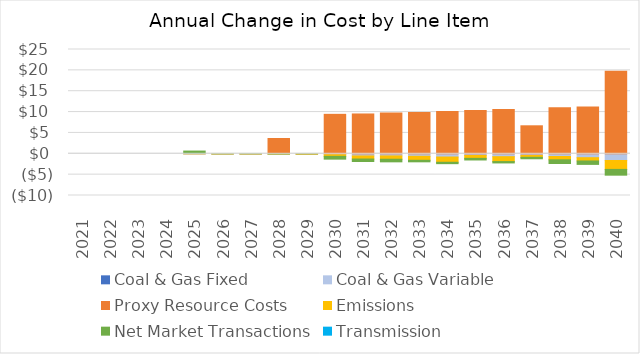
| Category | Coal & Gas Fixed | Coal & Gas Variable | Proxy Resource Costs | Emissions | Net Market Transactions | Transmission |
|---|---|---|---|---|---|---|
| 2021.0 | 0 | 0 | 0 | 0 | 0 | 0 |
| 2022.0 | 0 | 0 | 0 | 0 | 0 | 0 |
| 2023.0 | 0 | 0 | 0 | 0 | 0 | 0 |
| 2024.0 | 0 | 0 | 0 | 0 | 0 | 0 |
| 2025.0 | 0 | 0.019 | 0.005 | 0.023 | 0.606 | 0 |
| 2026.0 | 0 | -0.001 | 0 | -0.001 | -0.001 | 0 |
| 2027.0 | 0 | 0.001 | -0.007 | 0.001 | 0.024 | 0 |
| 2028.0 | 0 | -0.004 | 3.659 | -0.007 | -0.023 | 0 |
| 2029.0 | 0 | -0.023 | 0 | -0.038 | 0.01 | 0 |
| 2030.0 | 0 | -0.243 | 9.457 | -0.373 | -0.669 | 0 |
| 2031.0 | 0 | -0.514 | 9.544 | -0.743 | -0.596 | 0 |
| 2032.0 | 0 | -0.507 | 9.781 | -0.799 | -0.624 | 0 |
| 2033.0 | 0 | -0.597 | 9.906 | -0.961 | -0.369 | 0 |
| 2034.0 | 0 | -0.778 | 10.137 | -1.256 | -0.333 | 0 |
| 2035.0 | 0 | -0.408 | 10.372 | -0.686 | -0.39 | 0 |
| 2036.0 | 0 | -0.694 | 10.64 | -1.173 | -0.325 | 0 |
| 2037.0 | 0 | -0.416 | 6.71 | -0.424 | -0.357 | 0 |
| 2038.0 | 0 | -0.651 | 11.011 | -0.791 | -0.883 | 0 |
| 2039.0 | 0 | -0.937 | 11.243 | -0.786 | -0.819 | 0 |
| 2040.0 | 0 | -1.605 | 19.792 | -2.138 | -1.385 | 0 |